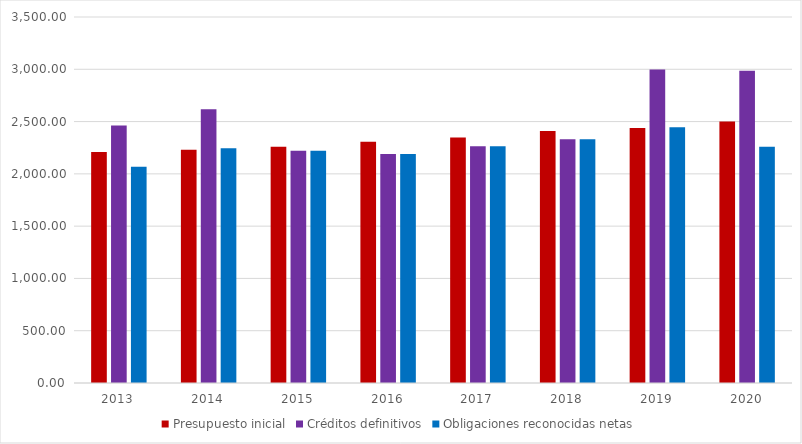
| Category | Presupuesto inicial | Créditos definitivos | Obligaciones reconocidas netas |
|---|---|---|---|
| 2013.0 | 2209.3 | 2462.534 | 2067.081 |
| 2014.0 | 2230.001 | 2617 | 2243.847 |
| 2015.0 | 2260.019 | 2220.814 | 2220.814 |
| 2016.0 | 2307.728 | 2190.718 | 2190.718 |
| 2017.0 | 2348.462 | 2263.368 | 2263.368 |
| 2018.0 | 2410.116 | 2330.279 | 2330.279 |
| 2019.0 | 2439.352 | 2996.974 | 2445.478 |
| 2020.0 | 2500.975 | 2986.225 | 2258.986 |